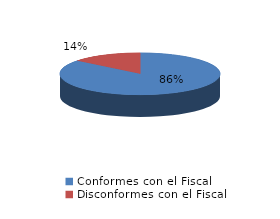
| Category | Series 0 |
|---|---|
| 0 | 24 |
| 1 | 4 |